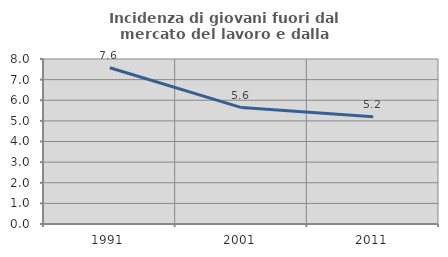
| Category | Incidenza di giovani fuori dal mercato del lavoro e dalla formazione  |
|---|---|
| 1991.0 | 7.577 |
| 2001.0 | 5.645 |
| 2011.0 | 5.204 |